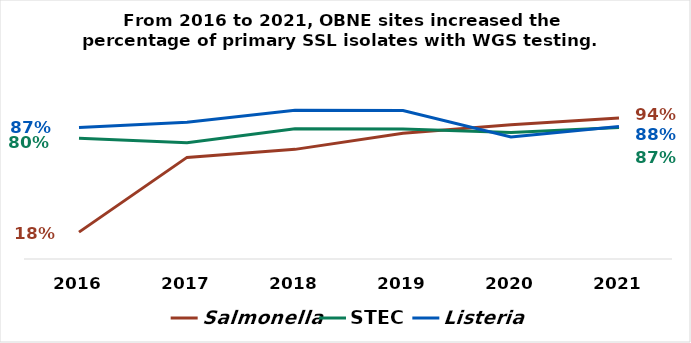
| Category | Salmonella | STEC | Listeria |
|---|---|---|---|
| 2016.0 | 17.822 | 79.989 | 87.211 |
| 2017.0 | 67.371 | 77.036 | 90.607 |
| 2018.0 | 72.684 | 86.3 | 98.57 |
| 2019.0 | 83.364 | 86.114 | 98.379 |
| 2020.0 | 88.992 | 83.881 | 80.831 |
| 2021.0 | 93.505 | 87.17 | 87.9 |